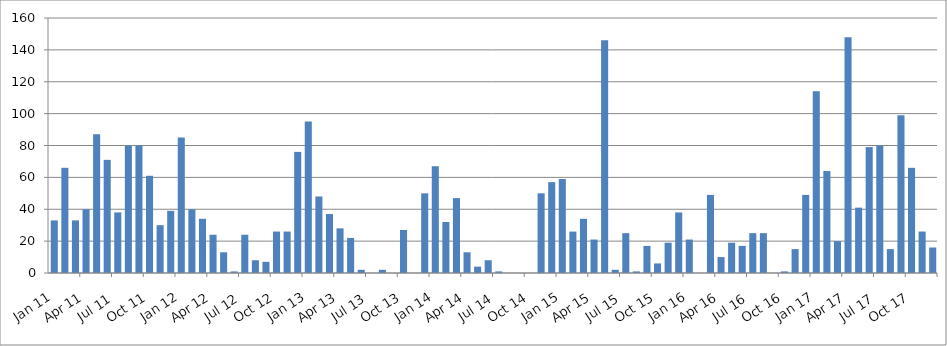
| Category | Series 0 |
|---|---|
| 2011-01-01 | 33 |
| 2011-02-01 | 66 |
| 2011-03-01 | 33 |
| 2011-04-01 | 40 |
| 2011-05-01 | 87 |
| 2011-06-01 | 71 |
| 2011-07-01 | 38 |
| 2011-08-01 | 80 |
| 2011-09-01 | 80 |
| 2011-10-01 | 61 |
| 2011-11-01 | 30 |
| 2011-12-01 | 39 |
| 2012-01-01 | 85 |
| 2012-02-01 | 40 |
| 2012-03-01 | 34 |
| 2012-04-01 | 24 |
| 2012-05-01 | 13 |
| 2012-06-01 | 1 |
| 2012-07-01 | 24 |
| 2012-08-01 | 8 |
| 2012-09-01 | 7 |
| 2012-10-01 | 26 |
| 2012-11-01 | 26 |
| 2012-12-01 | 76 |
| 2013-01-01 | 95 |
| 2013-02-01 | 48 |
| 2013-03-01 | 37 |
| 2013-04-01 | 28 |
| 2013-05-01 | 22 |
| 2013-06-01 | 2 |
| 2013-07-01 | 0 |
| 2013-08-01 | 2 |
| 2013-09-01 | 0 |
| 2013-10-01 | 27 |
| 2013-11-01 | 0 |
| 2013-12-01 | 50 |
| 2014-01-01 | 67 |
| 2014-02-01 | 32 |
| 2014-03-01 | 47 |
| 2014-04-01 | 13 |
| 2014-05-01 | 4 |
| 2014-06-01 | 8 |
| 2014-07-01 | 1 |
| 2014-08-01 | 0 |
| 2014-09-01 | 0 |
| 2014-10-01 | 0 |
| 2014-11-01 | 50 |
| 2014-12-01 | 57 |
| 2015-01-01 | 59 |
| 2015-02-01 | 26 |
| 2015-03-01 | 34 |
| 2015-04-01 | 21 |
| 2015-05-01 | 146 |
| 2015-06-01 | 2 |
| 2015-07-01 | 25 |
| 2015-08-01 | 1 |
| 2015-09-01 | 17 |
| 2015-10-01 | 6 |
| 2015-11-01 | 19 |
| 2015-12-01 | 38 |
| 2016-01-01 | 21 |
| 2016-02-01 | 0 |
| 2016-03-01 | 49 |
| 2016-04-01 | 10 |
| 2016-05-01 | 19 |
| 2016-06-01 | 17 |
| 2016-07-01 | 25 |
| 2016-08-01 | 25 |
| 2016-09-01 | 0 |
| 2016-10-01 | 1 |
| 2016-11-01 | 15 |
| 2016-12-01 | 49 |
| 2017-01-01 | 114 |
| 2017-02-01 | 64 |
| 2017-03-01 | 20 |
| 2017-04-01 | 148 |
| 2017-05-01 | 41 |
| 2017-06-01 | 79 |
| 2017-07-01 | 80 |
| 2017-08-01 | 15 |
| 2017-09-01 | 99 |
| 2017-10-01 | 66 |
| 2017-11-01 | 26 |
| 2017-12-01 | 16 |